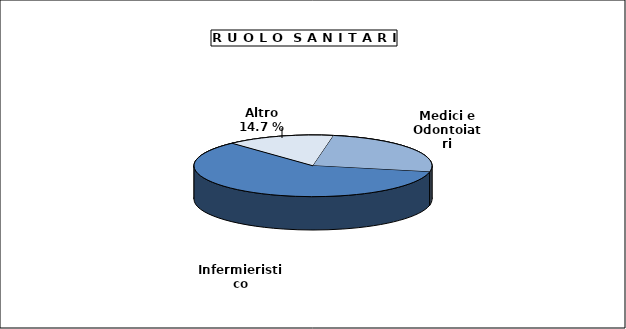
| Category | Personale Sanitario |
|---|---|
| Medici e Odontoiatri | 103274 |
| Infermieristico | 243658 |
| Altro | 59740 |